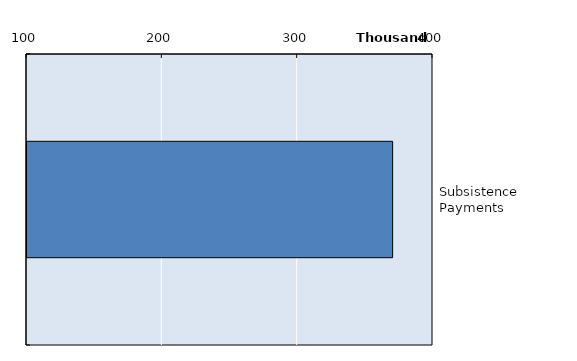
| Category | Series 0 |
|---|---|
| Subsistence Payments | 370159 |